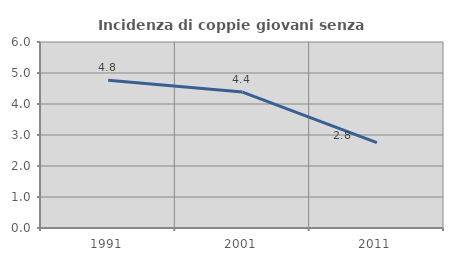
| Category | Incidenza di coppie giovani senza figli |
|---|---|
| 1991.0 | 4.767 |
| 2001.0 | 4.383 |
| 2011.0 | 2.752 |